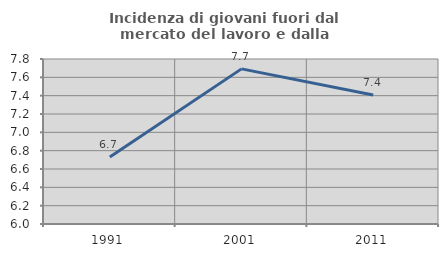
| Category | Incidenza di giovani fuori dal mercato del lavoro e dalla formazione  |
|---|---|
| 1991.0 | 6.731 |
| 2001.0 | 7.692 |
| 2011.0 | 7.407 |